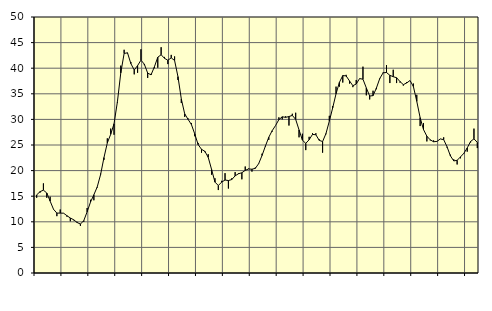
| Category | Piggar | Series 1 |
|---|---|---|
| nan | 14.7 | 15.26 |
| 87.0 | 15.7 | 15.89 |
| 87.0 | 17.5 | 16.18 |
| 87.0 | 14.7 | 15.63 |
| nan | 14.9 | 14.04 |
| 88.0 | 12.4 | 12.45 |
| 88.0 | 11.1 | 11.7 |
| 88.0 | 12.4 | 11.7 |
| nan | 11.7 | 11.68 |
| 89.0 | 11 | 11.19 |
| 89.0 | 10.1 | 10.74 |
| 89.0 | 10.3 | 10.4 |
| nan | 10 | 9.87 |
| 90.0 | 9.2 | 9.56 |
| 90.0 | 10 | 10.23 |
| 90.0 | 12.7 | 11.95 |
| nan | 14.3 | 13.85 |
| 91.0 | 14.2 | 15.28 |
| 91.0 | 16.7 | 16.81 |
| 91.0 | 19.4 | 19.22 |
| nan | 22.1 | 22.54 |
| 92.0 | 26.3 | 25.41 |
| 92.0 | 28.2 | 27.08 |
| 92.0 | 27 | 29.15 |
| nan | 33.3 | 33.45 |
| 93.0 | 40.5 | 39.08 |
| 93.0 | 43.6 | 42.88 |
| 93.0 | 42.9 | 43.01 |
| nan | 41.2 | 40.9 |
| 94.0 | 38.8 | 39.64 |
| 94.0 | 39.1 | 40.51 |
| 94.0 | 43.7 | 41.57 |
| nan | 40.6 | 40.79 |
| 95.0 | 38.1 | 39.05 |
| 95.0 | 38.9 | 38.7 |
| 95.0 | 40 | 40.28 |
| nan | 40.1 | 42.14 |
| 96.0 | 44.1 | 42.63 |
| 96.0 | 42.2 | 41.93 |
| 96.0 | 40.8 | 41.55 |
| nan | 42.6 | 42.02 |
| 97.0 | 42.3 | 41.51 |
| 97.0 | 37.7 | 38.35 |
| 97.0 | 33.2 | 33.99 |
| nan | 30.5 | 31.1 |
| 98.0 | 30.2 | 30.02 |
| 98.0 | 29.3 | 29 |
| 98.0 | 26.7 | 27.15 |
| nan | 25.4 | 25.08 |
| 99.0 | 23.5 | 24.16 |
| 99.0 | 23.6 | 23.77 |
| 99.0 | 23.2 | 22.59 |
| nan | 19.2 | 20.22 |
| 0.0 | 18.5 | 17.75 |
| 0.0 | 16.2 | 17.09 |
| 0.0 | 18 | 17.75 |
| nan | 19.5 | 18.16 |
| 1.0 | 16.5 | 18.06 |
| 1.0 | 18.5 | 18.25 |
| 1.0 | 19.7 | 18.97 |
| nan | 19.5 | 19.39 |
| 2.0 | 18.3 | 19.58 |
| 2.0 | 20.8 | 20.05 |
| 2.0 | 20.4 | 20.32 |
| nan | 19.8 | 20.27 |
| 3.0 | 20.6 | 20.44 |
| 3.0 | 21.3 | 21.36 |
| 3.0 | 23.3 | 22.95 |
| nan | 24.7 | 24.79 |
| 4.0 | 26 | 26.51 |
| 4.0 | 27.6 | 27.78 |
| 4.0 | 28.8 | 28.79 |
| nan | 30.4 | 29.95 |
| 5.0 | 30 | 30.51 |
| 5.0 | 30.6 | 30.4 |
| 5.0 | 28.8 | 30.56 |
| nan | 31.1 | 30.78 |
| 6.0 | 31.3 | 30 |
| 6.0 | 26.5 | 27.95 |
| 6.0 | 27.2 | 25.94 |
| nan | 24 | 25.32 |
| 7.0 | 26.6 | 26.03 |
| 7.0 | 27.3 | 27.07 |
| 7.0 | 27.3 | 27 |
| nan | 26.1 | 25.91 |
| 8.0 | 23.5 | 25.67 |
| 8.0 | 27.1 | 27.23 |
| 8.0 | 30.7 | 29.65 |
| nan | 32.6 | 32.25 |
| 9.0 | 36.4 | 35 |
| 9.0 | 36.4 | 37.24 |
| 9.0 | 37.2 | 38.56 |
| nan | 38.7 | 38.49 |
| 10.0 | 37 | 37.52 |
| 10.0 | 36.3 | 36.58 |
| 10.0 | 37.7 | 36.91 |
| nan | 38 | 37.97 |
| 11.0 | 40.3 | 37.85 |
| 11.0 | 34.7 | 36.15 |
| 11.0 | 33.9 | 34.57 |
| nan | 35.6 | 34.64 |
| 12.0 | 35.9 | 36.13 |
| 12.0 | 37.9 | 37.99 |
| 12.0 | 39.2 | 39.1 |
| nan | 40.6 | 39.16 |
| 13.0 | 37.1 | 38.61 |
| 13.0 | 39.7 | 38.34 |
| 13.0 | 37.1 | 38.14 |
| nan | 37.2 | 37.4 |
| 14.0 | 36.6 | 36.79 |
| 14.0 | 37.3 | 37.11 |
| 14.0 | 37.6 | 37.6 |
| nan | 37 | 36.4 |
| 15.0 | 34.8 | 33.53 |
| 15.0 | 28.7 | 30.34 |
| 15.0 | 29.3 | 28.01 |
| nan | 25.7 | 26.72 |
| 16.0 | 25.9 | 26.01 |
| 16.0 | 25.9 | 25.63 |
| 16.0 | 25.7 | 25.7 |
| nan | 26.2 | 26.18 |
| 17.0 | 26.5 | 26.05 |
| 17.0 | 24.5 | 24.65 |
| 17.0 | 23.1 | 22.88 |
| nan | 22.2 | 21.89 |
| 18.0 | 21.2 | 22.01 |
| 18.0 | 22.4 | 22.68 |
| 18.0 | 23.3 | 23.38 |
| nan | 23.7 | 24.43 |
| 19.0 | 25.5 | 25.69 |
| 19.0 | 28.2 | 26.2 |
| 19.0 | 24.4 | 25.51 |